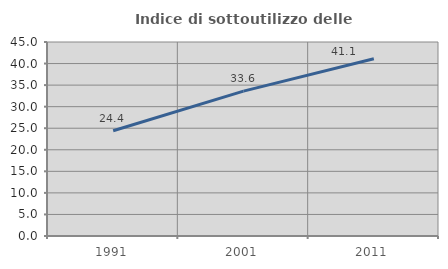
| Category | Indice di sottoutilizzo delle abitazioni  |
|---|---|
| 1991.0 | 24.427 |
| 2001.0 | 33.612 |
| 2011.0 | 41.121 |